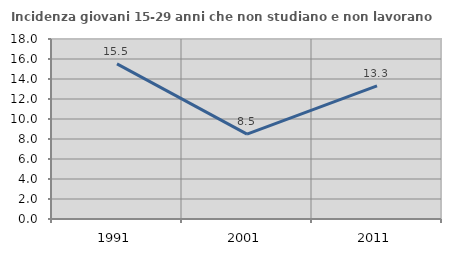
| Category | Incidenza giovani 15-29 anni che non studiano e non lavorano  |
|---|---|
| 1991.0 | 15.51 |
| 2001.0 | 8.482 |
| 2011.0 | 13.306 |